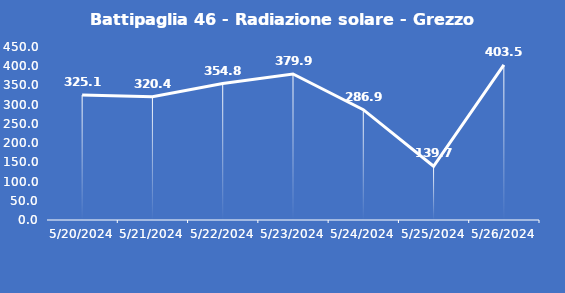
| Category | Battipaglia 46 - Radiazione solare - Grezzo (W/m2) |
|---|---|
| 5/20/24 | 325.1 |
| 5/21/24 | 320.4 |
| 5/22/24 | 354.8 |
| 5/23/24 | 379.9 |
| 5/24/24 | 286.9 |
| 5/25/24 | 139.7 |
| 5/26/24 | 403.5 |